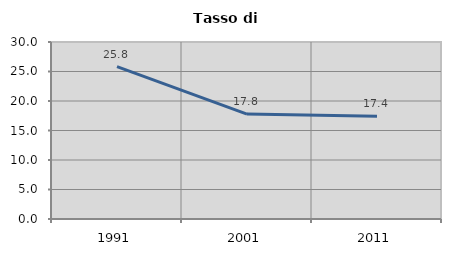
| Category | Tasso di disoccupazione   |
|---|---|
| 1991.0 | 25.841 |
| 2001.0 | 17.79 |
| 2011.0 | 17.395 |